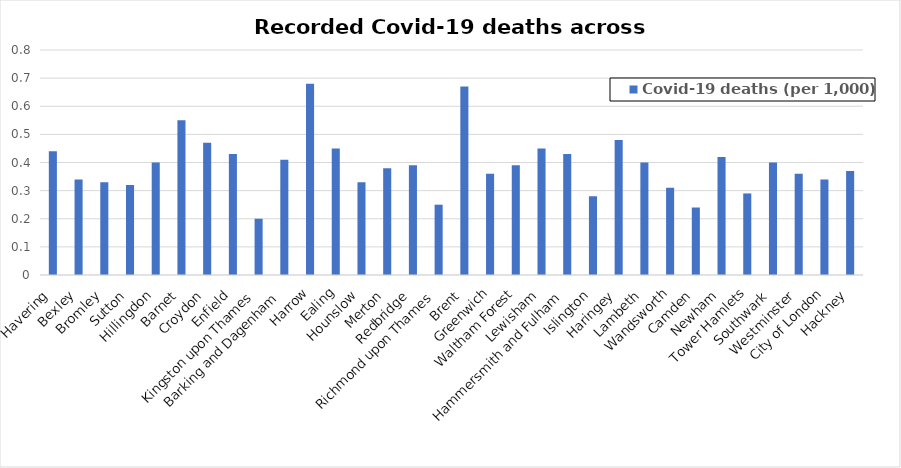
| Category | Covid-19 deaths (per 1,000) |
|---|---|
| Havering | 0.44 |
| Bexley | 0.34 |
| Bromley | 0.33 |
| Sutton | 0.32 |
| Hillingdon | 0.4 |
| Barnet | 0.55 |
| Croydon | 0.47 |
| Enfield | 0.43 |
| Kingston upon Thames | 0.2 |
| Barking and Dagenham | 0.41 |
| Harrow | 0.68 |
| Ealing | 0.45 |
| Hounslow | 0.33 |
| Merton | 0.38 |
| Redbridge | 0.39 |
| Richmond upon Thames | 0.25 |
| Brent | 0.67 |
| Greenwich | 0.36 |
| Waltham Forest | 0.39 |
| Lewisham | 0.45 |
| Hammersmith and Fulham | 0.43 |
| Islington | 0.28 |
| Haringey | 0.48 |
| Lambeth | 0.4 |
| Wandsworth | 0.31 |
| Camden | 0.24 |
| Newham | 0.42 |
| Tower Hamlets | 0.29 |
| Southwark | 0.4 |
| Westminster | 0.36 |
| City of London | 0.34 |
| Hackney | 0.37 |